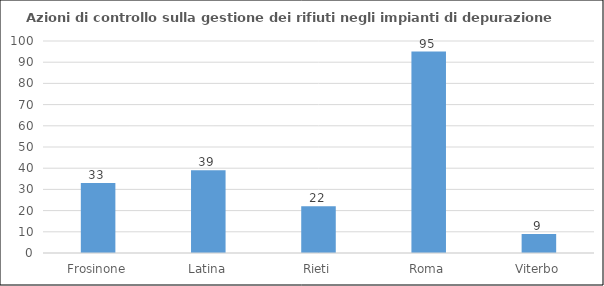
| Category | controllo matrice rifiuti sui depuratori |
|---|---|
| Frosinone | 33 |
| Latina | 39 |
| Rieti | 22 |
| Roma | 95 |
| Viterbo | 9 |